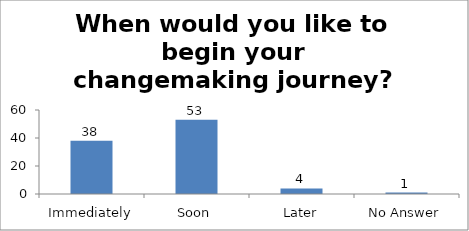
| Category | When would you like to begin your changemaking journey?  |
|---|---|
| Immediately | 38 |
| Soon | 53 |
| Later | 4 |
| No Answer | 1 |